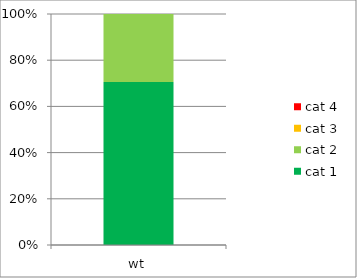
| Category | cat 1 | cat 2 | cat 3 | cat 4 |
|---|---|---|---|---|
| wt | 12 | 5 | 0 | 0 |